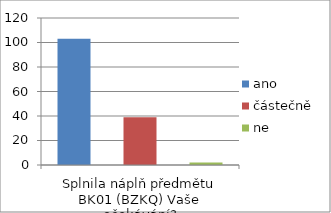
| Category | ano | částečně | ne |
|---|---|---|---|
| Splnila náplň předmětu BK01 (BZKQ) Vaše očekávání? | 103 | 39 | 2 |